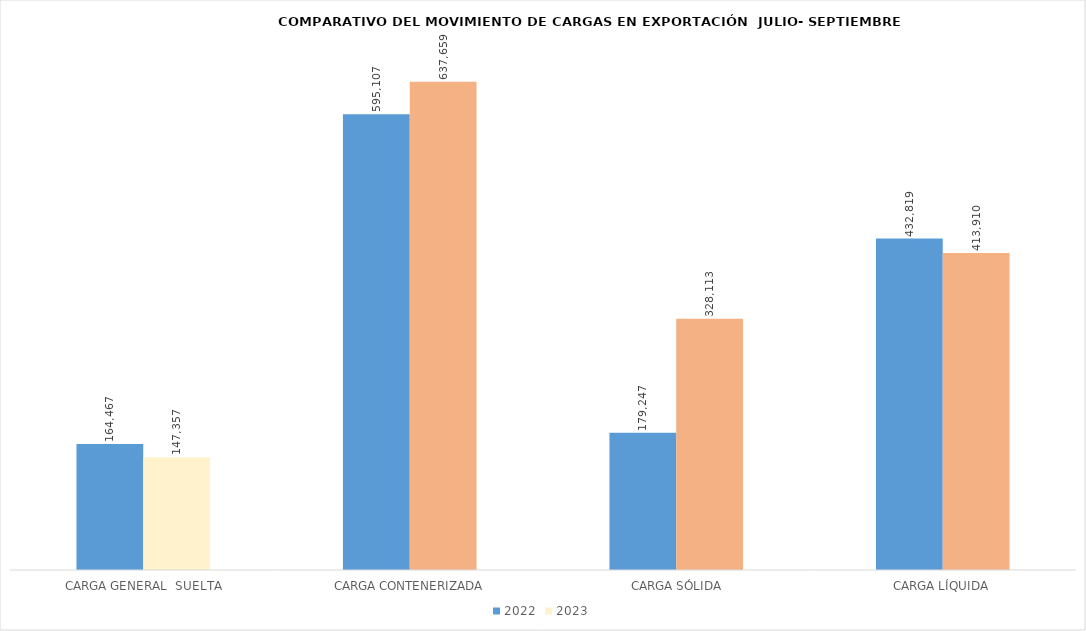
| Category | 2022 | 2023 |
|---|---|---|
|  CARGA GENERAL  SUELTA | 164467.45 | 147357 |
|  CARGA CONTENERIZADA | 595107 | 637659 |
|  CARGA SÓLIDA | 179247 | 328113 |
| CARGA LÍQUIDA | 432818.63 | 413910 |